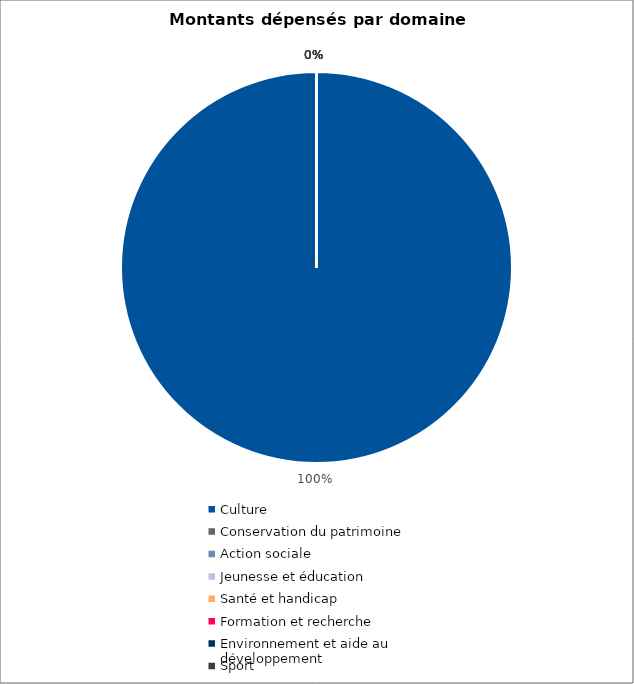
| Category | Series 0 |
|---|---|
| Culture | 500000 |
| Conservation du patrimoine | 0 |
| Action sociale | 0 |
| Jeunesse et éducation | 0 |
| Santé et handicap | 0 |
| Formation et recherche | 0 |
| Environnement et aide au
développement | 0 |
| Sport | 0 |
| Autres projets d’utilité publique | 0 |